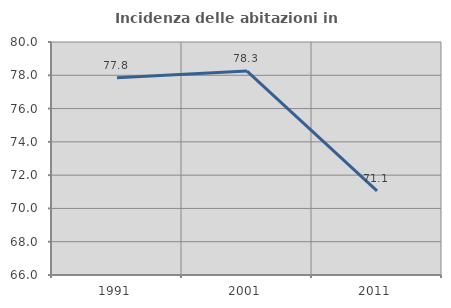
| Category | Incidenza delle abitazioni in proprietà  |
|---|---|
| 1991.0 | 77.847 |
| 2001.0 | 78.251 |
| 2011.0 | 71.05 |